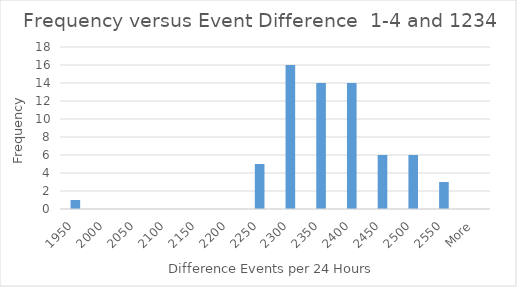
| Category | Frequency |
|---|---|
| 1950 | 1 |
| 2000 | 0 |
| 2050 | 0 |
| 2100 | 0 |
| 2150 | 0 |
| 2200 | 0 |
| 2250 | 5 |
| 2300 | 16 |
| 2350 | 14 |
| 2400 | 14 |
| 2450 | 6 |
| 2500 | 6 |
| 2550 | 3 |
| More | 0 |